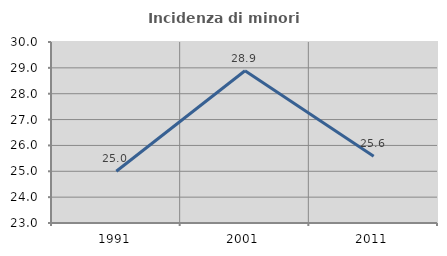
| Category | Incidenza di minori stranieri |
|---|---|
| 1991.0 | 25 |
| 2001.0 | 28.889 |
| 2011.0 | 25.581 |